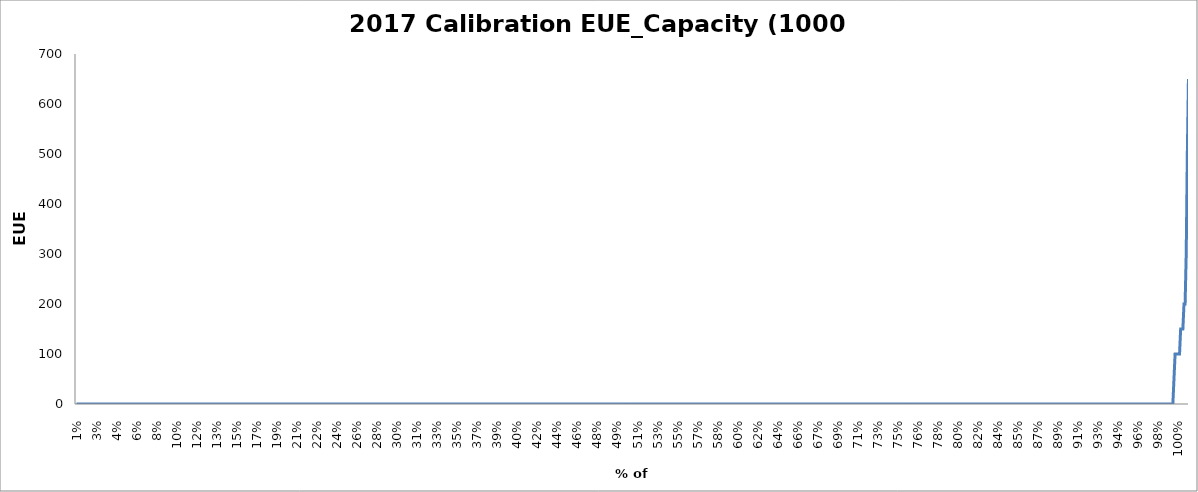
| Category | 2017 Calibration EUE_Capacity |
|---|---|
| 0.008 | 0 |
| 0.009 | 0 |
| 0.01 | 0 |
| 0.011 | 0 |
| 0.012 | 0 |
| 0.013 | 0 |
| 0.014 | 0 |
| 0.015 | 0 |
| 0.016 | 0 |
| 0.017 | 0 |
| 0.018 | 0 |
| 0.019 | 0 |
| 0.02 | 0 |
| 0.021 | 0 |
| 0.022 | 0 |
| 0.023 | 0 |
| 0.024 | 0 |
| 0.025 | 0 |
| 0.026 | 0 |
| 0.027 | 0 |
| 0.028 | 0 |
| 0.029 | 0 |
| 0.03 | 0 |
| 0.031 | 0 |
| 0.032 | 0 |
| 0.033 | 0 |
| 0.034 | 0 |
| 0.035 | 0 |
| 0.036 | 0 |
| 0.037 | 0 |
| 0.038 | 0 |
| 0.039 | 0 |
| 0.04 | 0 |
| 0.041 | 0 |
| 0.042 | 0 |
| 0.043 | 0 |
| 0.044 | 0 |
| 0.045 | 0 |
| 0.046 | 0 |
| 0.047 | 0 |
| 0.048 | 0 |
| 0.049 | 0 |
| 0.05 | 0 |
| 0.051 | 0 |
| 0.052 | 0 |
| 0.053 | 0 |
| 0.054 | 0 |
| 0.055 | 0 |
| 0.056 | 0 |
| 0.057 | 0 |
| 0.058 | 0 |
| 0.059 | 0 |
| 0.06 | 0 |
| 0.061 | 0 |
| 0.062 | 0 |
| 0.063 | 0 |
| 0.064 | 0 |
| 0.065 | 0 |
| 0.066 | 0 |
| 0.067 | 0 |
| 0.068 | 0 |
| 0.069 | 0 |
| 0.07 | 0 |
| 0.071 | 0 |
| 0.072 | 0 |
| 0.073 | 0 |
| 0.074 | 0 |
| 0.075 | 0 |
| 0.076 | 0 |
| 0.077 | 0 |
| 0.078 | 0 |
| 0.079 | 0 |
| 0.08 | 0 |
| 0.081 | 0 |
| 0.082 | 0 |
| 0.083 | 0 |
| 0.084 | 0 |
| 0.085 | 0 |
| 0.086 | 0 |
| 0.087 | 0 |
| 0.088 | 0 |
| 0.089 | 0 |
| 0.09 | 0 |
| 0.091 | 0 |
| 0.092 | 0 |
| 0.093 | 0 |
| 0.094 | 0 |
| 0.095 | 0 |
| 0.096 | 0 |
| 0.097 | 0 |
| 0.098 | 0 |
| 0.099 | 0 |
| 0.1 | 0 |
| 0.101 | 0 |
| 0.102 | 0 |
| 0.103 | 0 |
| 0.104 | 0 |
| 0.105 | 0 |
| 0.106 | 0 |
| 0.107 | 0 |
| 0.108 | 0 |
| 0.109 | 0 |
| 0.11 | 0 |
| 0.111 | 0 |
| 0.112 | 0 |
| 0.113 | 0 |
| 0.114 | 0 |
| 0.115 | 0 |
| 0.116 | 0 |
| 0.117 | 0 |
| 0.118 | 0 |
| 0.119 | 0 |
| 0.12 | 0 |
| 0.121 | 0 |
| 0.122 | 0 |
| 0.123 | 0 |
| 0.124 | 0 |
| 0.125 | 0 |
| 0.126 | 0 |
| 0.127 | 0 |
| 0.128 | 0 |
| 0.129 | 0 |
| 0.13 | 0 |
| 0.131 | 0 |
| 0.132 | 0 |
| 0.133 | 0 |
| 0.134 | 0 |
| 0.135 | 0 |
| 0.136 | 0 |
| 0.137 | 0 |
| 0.138 | 0 |
| 0.139 | 0 |
| 0.14 | 0 |
| 0.141 | 0 |
| 0.142 | 0 |
| 0.143 | 0 |
| 0.144 | 0 |
| 0.145 | 0 |
| 0.146 | 0 |
| 0.147 | 0 |
| 0.148 | 0 |
| 0.149 | 0 |
| 0.15 | 0 |
| 0.151 | 0 |
| 0.152 | 0 |
| 0.153 | 0 |
| 0.154 | 0 |
| 0.155 | 0 |
| 0.156 | 0 |
| 0.157 | 0 |
| 0.158 | 0 |
| 0.159 | 0 |
| 0.16 | 0 |
| 0.161 | 0 |
| 0.162 | 0 |
| 0.163 | 0 |
| 0.164 | 0 |
| 0.165 | 0 |
| 0.166 | 0 |
| 0.167 | 0 |
| 0.168 | 0 |
| 0.169 | 0 |
| 0.17 | 0 |
| 0.171 | 0 |
| 0.172 | 0 |
| 0.173 | 0 |
| 0.174 | 0 |
| 0.175 | 0 |
| 0.176 | 0 |
| 0.177 | 0 |
| 0.178 | 0 |
| 0.179 | 0 |
| 0.18 | 0 |
| 0.181 | 0 |
| 0.182 | 0 |
| 0.183 | 0 |
| 0.184 | 0 |
| 0.185 | 0 |
| 0.186 | 0 |
| 0.187 | 0 |
| 0.188 | 0 |
| 0.189 | 0 |
| 0.19 | 0 |
| 0.191 | 0 |
| 0.192 | 0 |
| 0.193 | 0 |
| 0.194 | 0 |
| 0.195 | 0 |
| 0.196 | 0 |
| 0.197 | 0 |
| 0.198 | 0 |
| 0.199 | 0 |
| 0.2 | 0 |
| 0.201 | 0 |
| 0.202 | 0 |
| 0.203 | 0 |
| 0.204 | 0 |
| 0.205 | 0 |
| 0.206 | 0 |
| 0.207 | 0 |
| 0.208 | 0 |
| 0.209 | 0 |
| 0.21 | 0 |
| 0.211 | 0 |
| 0.212 | 0 |
| 0.213 | 0 |
| 0.214 | 0 |
| 0.215 | 0 |
| 0.216 | 0 |
| 0.217 | 0 |
| 0.218 | 0 |
| 0.219 | 0 |
| 0.22 | 0 |
| 0.221 | 0 |
| 0.222 | 0 |
| 0.223 | 0 |
| 0.224 | 0 |
| 0.225 | 0 |
| 0.226 | 0 |
| 0.227 | 0 |
| 0.228 | 0 |
| 0.229 | 0 |
| 0.23 | 0 |
| 0.231 | 0 |
| 0.232 | 0 |
| 0.233 | 0 |
| 0.234 | 0 |
| 0.235 | 0 |
| 0.236 | 0 |
| 0.237 | 0 |
| 0.238 | 0 |
| 0.239 | 0 |
| 0.24 | 0 |
| 0.241 | 0 |
| 0.242 | 0 |
| 0.243 | 0 |
| 0.244 | 0 |
| 0.245 | 0 |
| 0.246 | 0 |
| 0.247 | 0 |
| 0.248 | 0 |
| 0.249 | 0 |
| 0.25 | 0 |
| 0.251 | 0 |
| 0.252 | 0 |
| 0.253 | 0 |
| 0.254 | 0 |
| 0.255 | 0 |
| 0.256 | 0 |
| 0.257 | 0 |
| 0.258 | 0 |
| 0.259 | 0 |
| 0.26 | 0 |
| 0.261 | 0 |
| 0.262 | 0 |
| 0.263 | 0 |
| 0.264 | 0 |
| 0.265 | 0 |
| 0.266 | 0 |
| 0.267 | 0 |
| 0.268 | 0 |
| 0.269 | 0 |
| 0.27 | 0 |
| 0.271 | 0 |
| 0.272 | 0 |
| 0.273 | 0 |
| 0.274 | 0 |
| 0.275 | 0 |
| 0.276 | 0 |
| 0.277 | 0 |
| 0.278 | 0 |
| 0.279 | 0 |
| 0.28 | 0 |
| 0.281 | 0 |
| 0.282 | 0 |
| 0.283 | 0 |
| 0.284 | 0 |
| 0.285 | 0 |
| 0.286 | 0 |
| 0.287 | 0 |
| 0.288 | 0 |
| 0.289 | 0 |
| 0.29 | 0 |
| 0.291 | 0 |
| 0.292 | 0 |
| 0.293 | 0 |
| 0.294 | 0 |
| 0.295 | 0 |
| 0.296 | 0 |
| 0.297 | 0 |
| 0.298 | 0 |
| 0.299 | 0 |
| 0.3 | 0 |
| 0.301 | 0 |
| 0.302 | 0 |
| 0.303 | 0 |
| 0.304 | 0 |
| 0.305 | 0 |
| 0.306 | 0 |
| 0.307 | 0 |
| 0.308 | 0 |
| 0.309 | 0 |
| 0.31 | 0 |
| 0.311 | 0 |
| 0.312 | 0 |
| 0.313 | 0 |
| 0.314 | 0 |
| 0.315 | 0 |
| 0.316 | 0 |
| 0.317 | 0 |
| 0.318 | 0 |
| 0.319 | 0 |
| 0.32 | 0 |
| 0.321 | 0 |
| 0.322 | 0 |
| 0.323 | 0 |
| 0.324 | 0 |
| 0.325 | 0 |
| 0.326 | 0 |
| 0.327 | 0 |
| 0.328 | 0 |
| 0.329 | 0 |
| 0.33 | 0 |
| 0.331 | 0 |
| 0.332 | 0 |
| 0.333 | 0 |
| 0.334 | 0 |
| 0.335 | 0 |
| 0.336 | 0 |
| 0.337 | 0 |
| 0.338 | 0 |
| 0.339 | 0 |
| 0.34 | 0 |
| 0.341 | 0 |
| 0.342 | 0 |
| 0.343 | 0 |
| 0.344 | 0 |
| 0.345 | 0 |
| 0.346 | 0 |
| 0.347 | 0 |
| 0.348 | 0 |
| 0.349 | 0 |
| 0.35 | 0 |
| 0.351 | 0 |
| 0.352 | 0 |
| 0.353 | 0 |
| 0.354 | 0 |
| 0.355 | 0 |
| 0.356 | 0 |
| 0.357 | 0 |
| 0.358 | 0 |
| 0.359 | 0 |
| 0.36 | 0 |
| 0.361 | 0 |
| 0.362 | 0 |
| 0.363 | 0 |
| 0.364 | 0 |
| 0.365 | 0 |
| 0.366 | 0 |
| 0.367 | 0 |
| 0.368 | 0 |
| 0.369 | 0 |
| 0.37 | 0 |
| 0.371 | 0 |
| 0.372 | 0 |
| 0.373 | 0 |
| 0.374 | 0 |
| 0.375 | 0 |
| 0.376 | 0 |
| 0.377 | 0 |
| 0.378 | 0 |
| 0.379 | 0 |
| 0.38 | 0 |
| 0.381 | 0 |
| 0.382 | 0 |
| 0.383 | 0 |
| 0.384 | 0 |
| 0.385 | 0 |
| 0.386 | 0 |
| 0.387 | 0 |
| 0.388 | 0 |
| 0.389 | 0 |
| 0.39 | 0 |
| 0.391 | 0 |
| 0.392 | 0 |
| 0.393 | 0 |
| 0.394 | 0 |
| 0.395 | 0 |
| 0.396 | 0 |
| 0.397 | 0 |
| 0.398 | 0 |
| 0.399 | 0 |
| 0.4 | 0 |
| 0.401 | 0 |
| 0.402 | 0 |
| 0.403 | 0 |
| 0.404 | 0 |
| 0.405 | 0 |
| 0.406 | 0 |
| 0.407 | 0 |
| 0.408 | 0 |
| 0.409 | 0 |
| 0.41 | 0 |
| 0.411 | 0 |
| 0.412 | 0 |
| 0.413 | 0 |
| 0.414 | 0 |
| 0.415 | 0 |
| 0.416 | 0 |
| 0.417 | 0 |
| 0.418 | 0 |
| 0.419 | 0 |
| 0.42 | 0 |
| 0.421 | 0 |
| 0.422 | 0 |
| 0.423 | 0 |
| 0.424 | 0 |
| 0.425 | 0 |
| 0.426 | 0 |
| 0.427 | 0 |
| 0.428 | 0 |
| 0.429 | 0 |
| 0.43 | 0 |
| 0.431 | 0 |
| 0.432 | 0 |
| 0.433 | 0 |
| 0.434 | 0 |
| 0.435 | 0 |
| 0.436 | 0 |
| 0.437 | 0 |
| 0.438 | 0 |
| 0.439 | 0 |
| 0.44 | 0 |
| 0.441 | 0 |
| 0.442 | 0 |
| 0.443 | 0 |
| 0.444 | 0 |
| 0.445 | 0 |
| 0.446 | 0 |
| 0.447 | 0 |
| 0.448 | 0 |
| 0.449 | 0 |
| 0.45 | 0 |
| 0.451 | 0 |
| 0.452 | 0 |
| 0.453 | 0 |
| 0.454 | 0 |
| 0.455 | 0 |
| 0.456 | 0 |
| 0.457 | 0 |
| 0.458 | 0 |
| 0.459 | 0 |
| 0.46 | 0 |
| 0.461 | 0 |
| 0.462 | 0 |
| 0.463 | 0 |
| 0.464 | 0 |
| 0.465 | 0 |
| 0.466 | 0 |
| 0.467 | 0 |
| 0.468 | 0 |
| 0.469 | 0 |
| 0.47 | 0 |
| 0.471 | 0 |
| 0.472 | 0 |
| 0.473 | 0 |
| 0.474 | 0 |
| 0.475 | 0 |
| 0.476 | 0 |
| 0.477 | 0 |
| 0.478 | 0 |
| 0.479 | 0 |
| 0.48 | 0 |
| 0.481 | 0 |
| 0.482 | 0 |
| 0.483 | 0 |
| 0.484 | 0 |
| 0.485 | 0 |
| 0.486 | 0 |
| 0.487 | 0 |
| 0.488 | 0 |
| 0.489 | 0 |
| 0.49 | 0 |
| 0.491 | 0 |
| 0.492 | 0 |
| 0.493 | 0 |
| 0.494 | 0 |
| 0.495 | 0 |
| 0.496 | 0 |
| 0.497 | 0 |
| 0.498 | 0 |
| 0.499 | 0 |
| 0.5 | 0 |
| 0.501 | 0 |
| 0.502 | 0 |
| 0.503 | 0 |
| 0.504 | 0 |
| 0.505 | 0 |
| 0.506 | 0 |
| 0.507 | 0 |
| 0.508 | 0 |
| 0.509 | 0 |
| 0.51 | 0 |
| 0.511 | 0 |
| 0.512 | 0 |
| 0.513 | 0 |
| 0.514 | 0 |
| 0.515 | 0 |
| 0.516 | 0 |
| 0.517 | 0 |
| 0.518 | 0 |
| 0.519 | 0 |
| 0.52 | 0 |
| 0.521 | 0 |
| 0.522 | 0 |
| 0.523 | 0 |
| 0.524 | 0 |
| 0.525 | 0 |
| 0.526 | 0 |
| 0.527 | 0 |
| 0.528 | 0 |
| 0.529 | 0 |
| 0.53 | 0 |
| 0.531 | 0 |
| 0.532 | 0 |
| 0.533 | 0 |
| 0.534 | 0 |
| 0.535 | 0 |
| 0.536 | 0 |
| 0.537 | 0 |
| 0.538 | 0 |
| 0.539 | 0 |
| 0.54 | 0 |
| 0.541 | 0 |
| 0.542 | 0 |
| 0.543 | 0 |
| 0.544 | 0 |
| 0.545 | 0 |
| 0.546 | 0 |
| 0.547 | 0 |
| 0.548 | 0 |
| 0.549 | 0 |
| 0.55 | 0 |
| 0.551 | 0 |
| 0.552 | 0 |
| 0.553 | 0 |
| 0.554 | 0 |
| 0.555 | 0 |
| 0.556 | 0 |
| 0.557 | 0 |
| 0.558 | 0 |
| 0.559 | 0 |
| 0.56 | 0 |
| 0.561 | 0 |
| 0.562 | 0 |
| 0.563 | 0 |
| 0.564 | 0 |
| 0.565 | 0 |
| 0.566 | 0 |
| 0.567 | 0 |
| 0.568 | 0 |
| 0.569 | 0 |
| 0.57 | 0 |
| 0.571 | 0 |
| 0.572 | 0 |
| 0.573 | 0 |
| 0.574 | 0 |
| 0.575 | 0 |
| 0.576 | 0 |
| 0.577 | 0 |
| 0.578 | 0 |
| 0.579 | 0 |
| 0.58 | 0 |
| 0.581 | 0 |
| 0.582 | 0 |
| 0.583 | 0 |
| 0.584 | 0 |
| 0.585 | 0 |
| 0.586 | 0 |
| 0.587 | 0 |
| 0.588 | 0 |
| 0.589 | 0 |
| 0.59 | 0 |
| 0.591 | 0 |
| 0.592 | 0 |
| 0.593 | 0 |
| 0.594 | 0 |
| 0.595 | 0 |
| 0.596 | 0 |
| 0.597 | 0 |
| 0.598 | 0 |
| 0.599 | 0 |
| 0.6 | 0 |
| 0.601 | 0 |
| 0.602 | 0 |
| 0.603 | 0 |
| 0.604 | 0 |
| 0.605 | 0 |
| 0.606 | 0 |
| 0.607 | 0 |
| 0.608 | 0 |
| 0.609 | 0 |
| 0.61 | 0 |
| 0.611 | 0 |
| 0.612 | 0 |
| 0.613 | 0 |
| 0.614 | 0 |
| 0.615 | 0 |
| 0.616 | 0 |
| 0.617 | 0 |
| 0.618 | 0 |
| 0.619 | 0 |
| 0.62 | 0 |
| 0.621 | 0 |
| 0.622 | 0 |
| 0.623 | 0 |
| 0.624 | 0 |
| 0.625 | 0 |
| 0.626 | 0 |
| 0.627 | 0 |
| 0.628 | 0 |
| 0.629 | 0 |
| 0.63 | 0 |
| 0.631 | 0 |
| 0.632 | 0 |
| 0.633 | 0 |
| 0.634 | 0 |
| 0.635 | 0 |
| 0.636 | 0 |
| 0.637 | 0 |
| 0.638 | 0 |
| 0.639 | 0 |
| 0.64 | 0 |
| 0.641 | 0 |
| 0.642 | 0 |
| 0.643 | 0 |
| 0.644 | 0 |
| 0.645 | 0 |
| 0.646 | 0 |
| 0.647 | 0 |
| 0.648 | 0 |
| 0.649 | 0 |
| 0.65 | 0 |
| 0.651 | 0 |
| 0.652 | 0 |
| 0.653 | 0 |
| 0.654 | 0 |
| 0.655 | 0 |
| 0.656 | 0 |
| 0.657 | 0 |
| 0.658 | 0 |
| 0.659 | 0 |
| 0.66 | 0 |
| 0.661 | 0 |
| 0.662 | 0 |
| 0.663 | 0 |
| 0.664 | 0 |
| 0.665 | 0 |
| 0.666 | 0 |
| 0.667 | 0 |
| 0.668 | 0 |
| 0.669 | 0 |
| 0.67 | 0 |
| 0.671 | 0 |
| 0.672 | 0 |
| 0.673 | 0 |
| 0.674 | 0 |
| 0.675 | 0 |
| 0.676 | 0 |
| 0.677 | 0 |
| 0.678 | 0 |
| 0.679 | 0 |
| 0.68 | 0 |
| 0.681 | 0 |
| 0.682 | 0 |
| 0.683 | 0 |
| 0.684 | 0 |
| 0.685 | 0 |
| 0.686 | 0 |
| 0.687 | 0 |
| 0.688 | 0 |
| 0.689 | 0 |
| 0.69 | 0 |
| 0.691 | 0 |
| 0.692 | 0 |
| 0.693 | 0 |
| 0.694 | 0 |
| 0.695 | 0 |
| 0.696 | 0 |
| 0.697 | 0 |
| 0.698 | 0 |
| 0.699 | 0 |
| 0.7 | 0 |
| 0.701 | 0 |
| 0.702 | 0 |
| 0.703 | 0 |
| 0.704 | 0 |
| 0.705 | 0 |
| 0.706 | 0 |
| 0.707 | 0 |
| 0.708 | 0 |
| 0.709 | 0 |
| 0.71 | 0 |
| 0.711 | 0 |
| 0.712 | 0 |
| 0.713 | 0 |
| 0.714 | 0 |
| 0.715 | 0 |
| 0.716 | 0 |
| 0.717 | 0 |
| 0.718 | 0 |
| 0.719 | 0 |
| 0.72 | 0 |
| 0.721 | 0 |
| 0.722 | 0 |
| 0.723 | 0 |
| 0.724 | 0 |
| 0.725 | 0 |
| 0.726 | 0 |
| 0.727 | 0 |
| 0.728 | 0 |
| 0.729 | 0 |
| 0.73 | 0 |
| 0.731 | 0 |
| 0.732 | 0 |
| 0.733 | 0 |
| 0.734 | 0 |
| 0.735 | 0 |
| 0.736 | 0 |
| 0.737 | 0 |
| 0.738 | 0 |
| 0.739 | 0 |
| 0.74 | 0 |
| 0.741 | 0 |
| 0.742 | 0 |
| 0.743 | 0 |
| 0.744 | 0 |
| 0.745 | 0 |
| 0.746 | 0 |
| 0.747 | 0 |
| 0.748 | 0 |
| 0.749 | 0 |
| 0.75 | 0 |
| 0.751 | 0 |
| 0.752 | 0 |
| 0.753 | 0 |
| 0.754 | 0 |
| 0.755 | 0 |
| 0.756 | 0 |
| 0.757 | 0 |
| 0.758 | 0 |
| 0.759 | 0 |
| 0.76 | 0 |
| 0.761 | 0 |
| 0.762 | 0 |
| 0.763 | 0 |
| 0.764 | 0 |
| 0.765 | 0 |
| 0.766 | 0 |
| 0.767 | 0 |
| 0.768 | 0 |
| 0.769 | 0 |
| 0.77 | 0 |
| 0.771 | 0 |
| 0.772 | 0 |
| 0.773 | 0 |
| 0.774 | 0 |
| 0.775 | 0 |
| 0.776 | 0 |
| 0.777 | 0 |
| 0.778 | 0 |
| 0.779 | 0 |
| 0.78 | 0 |
| 0.781 | 0 |
| 0.782 | 0 |
| 0.783 | 0 |
| 0.784 | 0 |
| 0.785 | 0 |
| 0.786 | 0 |
| 0.787 | 0 |
| 0.788 | 0 |
| 0.789 | 0 |
| 0.79 | 0 |
| 0.791 | 0 |
| 0.792 | 0 |
| 0.793 | 0 |
| 0.794 | 0 |
| 0.795 | 0 |
| 0.796 | 0 |
| 0.797 | 0 |
| 0.798 | 0 |
| 0.799 | 0 |
| 0.8 | 0 |
| 0.801 | 0 |
| 0.802 | 0 |
| 0.803 | 0 |
| 0.804 | 0 |
| 0.805 | 0 |
| 0.806 | 0 |
| 0.807 | 0 |
| 0.808 | 0 |
| 0.809 | 0 |
| 0.81 | 0 |
| 0.811 | 0 |
| 0.812 | 0 |
| 0.813 | 0 |
| 0.814 | 0 |
| 0.815 | 0 |
| 0.816 | 0 |
| 0.817 | 0 |
| 0.818 | 0 |
| 0.819 | 0 |
| 0.82 | 0 |
| 0.821 | 0 |
| 0.822 | 0 |
| 0.823 | 0 |
| 0.824 | 0 |
| 0.825 | 0 |
| 0.826 | 0 |
| 0.827 | 0 |
| 0.828 | 0 |
| 0.829 | 0 |
| 0.83 | 0 |
| 0.831 | 0 |
| 0.832 | 0 |
| 0.833 | 0 |
| 0.834 | 0 |
| 0.835 | 0 |
| 0.836 | 0 |
| 0.837 | 0 |
| 0.838 | 0 |
| 0.839 | 0 |
| 0.84 | 0 |
| 0.841 | 0 |
| 0.842 | 0 |
| 0.843 | 0 |
| 0.844 | 0 |
| 0.845 | 0 |
| 0.846 | 0 |
| 0.847 | 0 |
| 0.848 | 0 |
| 0.849 | 0 |
| 0.85 | 0 |
| 0.851 | 0 |
| 0.852 | 0 |
| 0.853 | 0 |
| 0.854 | 0 |
| 0.855 | 0 |
| 0.856 | 0 |
| 0.857 | 0 |
| 0.858 | 0 |
| 0.859 | 0 |
| 0.86 | 0 |
| 0.861 | 0 |
| 0.862 | 0 |
| 0.863 | 0 |
| 0.864 | 0 |
| 0.865 | 0 |
| 0.866 | 0 |
| 0.867 | 0 |
| 0.868 | 0 |
| 0.869 | 0 |
| 0.87 | 0 |
| 0.871 | 0 |
| 0.872 | 0 |
| 0.873 | 0 |
| 0.874 | 0 |
| 0.875 | 0 |
| 0.876 | 0 |
| 0.877 | 0 |
| 0.878 | 0 |
| 0.879 | 0 |
| 0.88 | 0 |
| 0.881 | 0 |
| 0.882 | 0 |
| 0.883 | 0 |
| 0.884 | 0 |
| 0.885 | 0 |
| 0.886 | 0 |
| 0.887 | 0 |
| 0.888 | 0 |
| 0.889 | 0 |
| 0.89 | 0 |
| 0.891 | 0 |
| 0.892 | 0 |
| 0.893 | 0 |
| 0.894 | 0 |
| 0.895 | 0 |
| 0.896 | 0 |
| 0.897 | 0 |
| 0.898 | 0 |
| 0.899 | 0 |
| 0.9 | 0 |
| 0.901 | 0 |
| 0.902 | 0 |
| 0.903 | 0 |
| 0.904 | 0 |
| 0.905 | 0 |
| 0.906 | 0 |
| 0.907 | 0 |
| 0.908 | 0 |
| 0.909 | 0 |
| 0.91 | 0 |
| 0.911 | 0 |
| 0.912 | 0 |
| 0.913 | 0 |
| 0.914 | 0 |
| 0.915 | 0 |
| 0.916 | 0 |
| 0.917 | 0 |
| 0.918 | 0 |
| 0.919 | 0 |
| 0.92 | 0 |
| 0.921 | 0 |
| 0.922 | 0 |
| 0.923 | 0 |
| 0.924 | 0 |
| 0.925 | 0 |
| 0.926 | 0 |
| 0.927 | 0 |
| 0.928 | 0 |
| 0.929 | 0 |
| 0.93 | 0 |
| 0.931 | 0 |
| 0.932 | 0 |
| 0.933 | 0 |
| 0.934 | 0 |
| 0.935 | 0 |
| 0.936 | 0 |
| 0.937 | 0 |
| 0.938 | 0 |
| 0.939 | 0 |
| 0.94 | 0 |
| 0.941 | 0 |
| 0.942 | 0 |
| 0.943 | 0 |
| 0.944 | 0 |
| 0.945 | 0 |
| 0.946 | 0 |
| 0.947 | 0 |
| 0.948 | 0 |
| 0.949 | 0 |
| 0.95 | 0 |
| 0.951 | 0 |
| 0.952 | 0 |
| 0.953 | 0 |
| 0.954 | 0 |
| 0.955 | 0 |
| 0.956 | 0 |
| 0.957 | 0 |
| 0.958 | 0 |
| 0.959 | 0 |
| 0.96 | 0 |
| 0.961 | 0 |
| 0.962 | 0 |
| 0.963 | 0 |
| 0.964 | 0 |
| 0.965 | 0 |
| 0.966 | 0 |
| 0.967 | 0 |
| 0.968 | 0 |
| 0.969 | 0 |
| 0.97 | 0 |
| 0.971 | 0 |
| 0.972 | 0 |
| 0.973 | 0 |
| 0.974 | 0 |
| 0.975 | 0 |
| 0.976 | 0 |
| 0.977 | 0 |
| 0.978 | 0 |
| 0.979 | 0 |
| 0.98 | 0 |
| 0.981 | 0 |
| 0.982 | 0 |
| 0.983 | 0 |
| 0.984 | 0 |
| 0.985 | 0 |
| 0.986 | 0 |
| 0.987 | 0 |
| 0.988 | 0 |
| 0.989 | 0 |
| 0.99 | 0 |
| 0.991 | 0 |
| 0.992 | 0 |
| 0.993 | 0 |
| 0.994 | 50 |
| 0.995 | 100 |
| 0.996 | 100 |
| 0.997 | 100 |
| 0.998 | 100 |
| 0.999 | 100 |
| 1.0 | 150 |
| 1.001 | 150 |
| 1.002 | 150 |
| 1.003 | 200 |
| 1.004 | 200 |
| 1.004 | 300 |
| 1.004 | 500 |
| 1.004 | 650 |